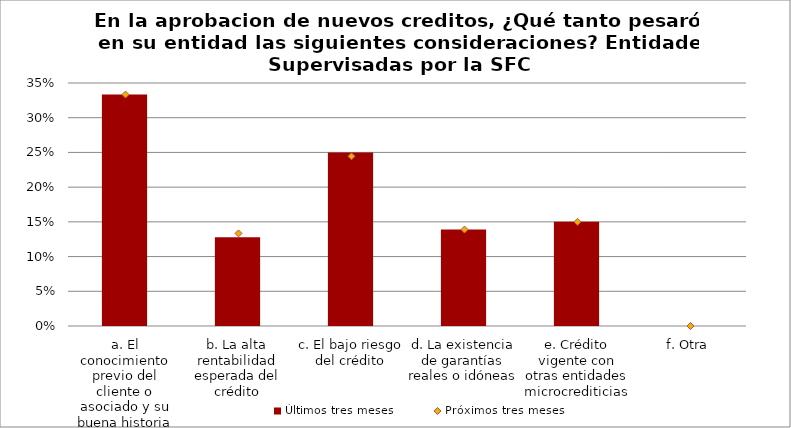
| Category | Últimos tres meses |
|---|---|
| a. El conocimiento previo del cliente o asociado y su buena historia de crédito | 0.333 |
| b. La alta rentabilidad esperada del crédito | 0.128 |
| c. El bajo riesgo del crédito | 0.25 |
| d. La existencia de garantías reales o idóneas | 0.139 |
| e. Crédito vigente con otras entidades microcrediticias | 0.15 |
| f. Otra | 0 |